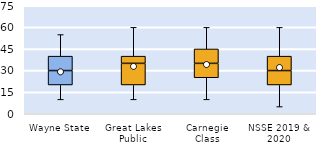
| Category | 25th | 50th | 75th |
|---|---|---|---|
| Wayne State | 20 | 10 | 10 |
| Great Lakes Public | 20 | 15 | 5 |
| Carnegie Class | 25 | 10 | 10 |
| NSSE 2019 & 2020 | 20 | 10 | 10 |